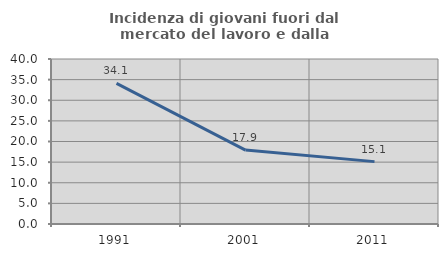
| Category | Incidenza di giovani fuori dal mercato del lavoro e dalla formazione  |
|---|---|
| 1991.0 | 34.1 |
| 2001.0 | 17.928 |
| 2011.0 | 15.122 |